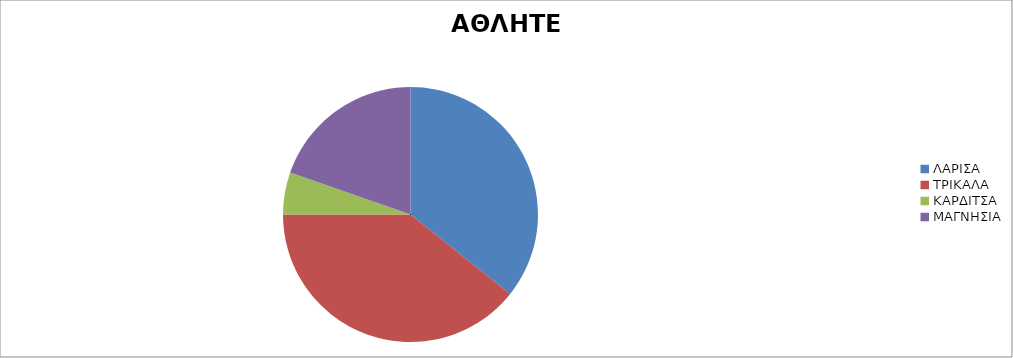
| Category | ΑΘΛΗΤΕΣ |
|---|---|
| ΛΑΡΙΣΑ | 20 |
| ΤΡΙΚΑΛΑ | 22 |
| ΚΑΡΔΙΤΣΑ | 3 |
| ΜΑΓΝΗΣΙΑ | 11 |